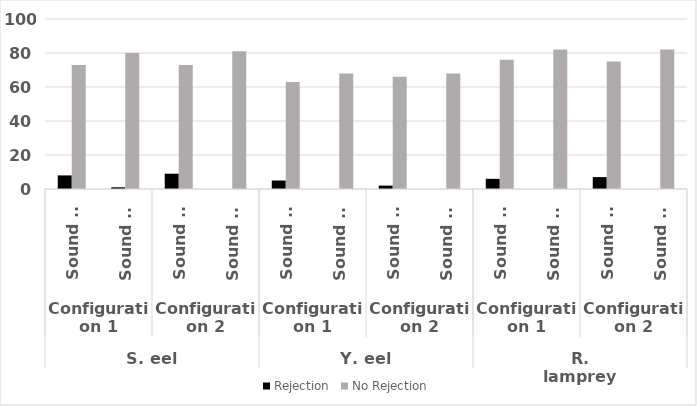
| Category | Rejection | No Rejection |
|---|---|---|
| 0 | 8 | 73 |
| 1 | 1 | 80 |
| 2 | 9 | 73 |
| 3 | 0 | 81 |
| 4 | 5 | 63 |
| 5 | 0 | 68 |
| 6 | 2 | 66 |
| 7 | 0 | 68 |
| 8 | 6 | 76 |
| 9 | 0 | 82 |
| 10 | 7 | 75 |
| 11 | 0 | 82 |